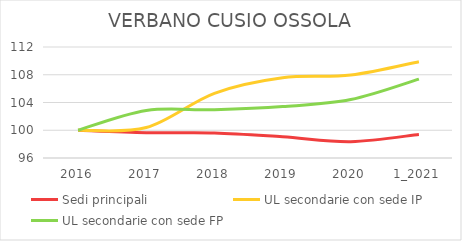
| Category | Sedi principali | UL secondarie con sede IP | UL secondarie con sede FP |
|---|---|---|---|
| 2016 | 100 | 100 | 100 |
| 2017 | 99.64 | 100.386 | 102.857 |
| 2018 | 99.613 | 105.328 | 102.949 |
| 2019 | 99.053 | 107.568 | 103.41 |
| 2020 | 98.359 | 107.954 | 104.424 |
| 1_2021 | 99.4 | 109.884 | 107.373 |